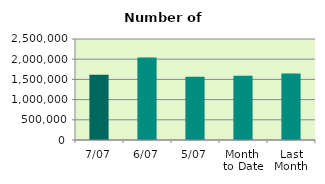
| Category | Series 0 |
|---|---|
| 7/07 | 1614784 |
| 6/07 | 2039972 |
| 5/07 | 1568104 |
| Month 
to Date | 1589854 |
| Last
Month | 1646651.818 |